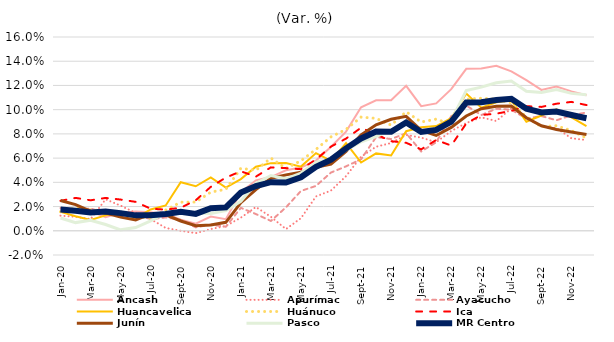
| Category | Áncash | Apurímac | Ayacucho | Huancavelica | Huánuco | Ica | Junín | Pasco | MR Centro |
|---|---|---|---|---|---|---|---|---|---|
| 2020-01-01 | 0.018 | 0.012 | 0.019 | 0.016 | 0.016 | 0.025 | 0.025 | 0.011 | 0.018 |
| 2020-02-01 | 0.017 | 0.012 | 0.017 | 0.012 | 0.019 | 0.027 | 0.022 | 0.007 | 0.016 |
| 2020-03-01 | 0.016 | 0.01 | 0.019 | 0.009 | 0.017 | 0.025 | 0.016 | 0.009 | 0.015 |
| 2020-04-01 | 0.011 | 0.026 | 0.014 | 0.013 | 0.016 | 0.027 | 0.015 | 0.005 | 0.016 |
| 2020-05-01 | 0.015 | 0.021 | 0.013 | 0.015 | 0.015 | 0.026 | 0.011 | 0.001 | 0.015 |
| 2020-06-01 | 0.016 | 0.015 | 0.013 | 0.011 | 0.012 | 0.024 | 0.009 | 0.003 | 0.013 |
| 2020-07-01 | 0.015 | 0.01 | 0.01 | 0.018 | 0.011 | 0.018 | 0.014 | 0.008 | 0.013 |
| 2020-08-01 | 0.014 | 0.002 | 0.011 | 0.021 | 0.017 | 0.017 | 0.013 | 0.015 | 0.014 |
| 2020-09-01 | 0.009 | 0 | 0.009 | 0.04 | 0.024 | 0.019 | 0.008 | 0.016 | 0.016 |
| 2020-10-01 | 0.006 | -0.002 | 0.003 | 0.037 | 0.024 | 0.025 | 0.004 | 0.015 | 0.014 |
| 2020-11-01 | 0.012 | 0.001 | 0.005 | 0.044 | 0.032 | 0.036 | 0.005 | 0.014 | 0.019 |
| 2020-12-01 | 0.01 | 0.004 | 0.003 | 0.036 | 0.034 | 0.044 | 0.007 | 0.017 | 0.019 |
| 2021-01-01 | 0.032 | 0.011 | 0.019 | 0.043 | 0.052 | 0.049 | 0.023 | 0.024 | 0.032 |
| 2021-02-01 | 0.042 | 0.02 | 0.014 | 0.053 | 0.05 | 0.045 | 0.034 | 0.039 | 0.037 |
| 2021-03-01 | 0.044 | 0.012 | 0.008 | 0.056 | 0.06 | 0.052 | 0.043 | 0.046 | 0.04 |
| 2021-04-01 | 0.05 | 0.001 | 0.019 | 0.056 | 0.051 | 0.052 | 0.046 | 0.043 | 0.04 |
| 2021-05-01 | 0.052 | 0.01 | 0.033 | 0.053 | 0.058 | 0.051 | 0.048 | 0.048 | 0.044 |
| 2021-06-01 | 0.058 | 0.028 | 0.037 | 0.064 | 0.067 | 0.059 | 0.052 | 0.057 | 0.053 |
| 2021-07-01 | 0.069 | 0.033 | 0.048 | 0.058 | 0.078 | 0.07 | 0.055 | 0.059 | 0.059 |
| 2021-08-01 | 0.082 | 0.045 | 0.053 | 0.072 | 0.084 | 0.076 | 0.066 | 0.067 | 0.068 |
| 2021-09-01 | 0.102 | 0.061 | 0.059 | 0.056 | 0.094 | 0.085 | 0.079 | 0.073 | 0.076 |
| 2021-10-01 | 0.108 | 0.069 | 0.077 | 0.064 | 0.093 | 0.08 | 0.087 | 0.078 | 0.082 |
| 2021-11-01 | 0.108 | 0.072 | 0.076 | 0.062 | 0.087 | 0.074 | 0.092 | 0.083 | 0.082 |
| 2021-12-01 | 0.12 | 0.079 | 0.081 | 0.082 | 0.098 | 0.073 | 0.095 | 0.089 | 0.089 |
| 2022-01-01 | 0.103 | 0.077 | 0.066 | 0.085 | 0.09 | 0.067 | 0.083 | 0.082 | 0.082 |
| 2022-02-01 | 0.105 | 0.073 | 0.073 | 0.086 | 0.092 | 0.075 | 0.079 | 0.082 | 0.083 |
| 2022-03-01 | 0.117 | 0.082 | 0.095 | 0.093 | 0.088 | 0.07 | 0.085 | 0.091 | 0.09 |
| 2022-04-01 | 0.134 | 0.089 | 0.103 | 0.113 | 0.109 | 0.089 | 0.095 | 0.116 | 0.106 |
| 2022-05-01 | 0.134 | 0.094 | 0.096 | 0.102 | 0.109 | 0.096 | 0.101 | 0.119 | 0.106 |
| 2022-06-01 | 0.136 | 0.091 | 0.101 | 0.106 | 0.109 | 0.097 | 0.103 | 0.122 | 0.108 |
| 2022-07-01 | 0.132 | 0.101 | 0.1 | 0.108 | 0.106 | 0.099 | 0.103 | 0.124 | 0.109 |
| 2022-08-01 | 0.124 | 0.094 | 0.093 | 0.09 | 0.094 | 0.103 | 0.093 | 0.115 | 0.101 |
| 2022-09-01 | 0.116 | 0.086 | 0.095 | 0.095 | 0.086 | 0.102 | 0.087 | 0.114 | 0.098 |
| 2022-10-01 | 0.119 | 0.085 | 0.091 | 0.1 | 0.087 | 0.105 | 0.084 | 0.117 | 0.098 |
| 2022-11-01 | 0.115 | 0.076 | 0.095 | 0.094 | 0.083 | 0.106 | 0.082 | 0.113 | 0.096 |
| 2022-12-01 | 0.112 | 0.075 | 0.098 | 0.086 | 0.077 | 0.104 | 0.079 | 0.112 | 0.093 |